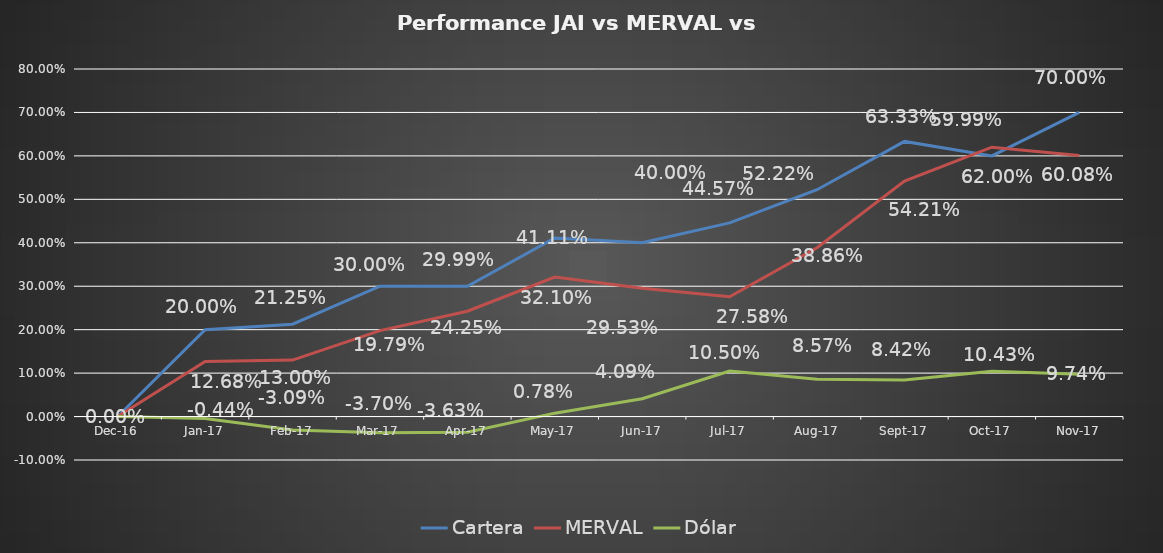
| Category | Cartera | MERVAL | Dólar |
|---|---|---|---|
| 2016-12-01 | 0 | 0 | 0 |
| 2017-01-01 | 0.2 | 0.127 | -0.004 |
| 2017-02-01 | 0.212 | 0.13 | -0.031 |
| 2017-03-01 | 0.3 | 0.198 | -0.037 |
| 2017-04-01 | 0.3 | 0.242 | -0.036 |
| 2017-05-01 | 0.411 | 0.321 | 0.008 |
| 2017-06-01 | 0.4 | 0.295 | 0.041 |
| 2017-07-01 | 0.446 | 0.276 | 0.105 |
| 2017-08-01 | 0.522 | 0.389 | 0.086 |
| 2017-09-01 | 0.633 | 0.542 | 0.084 |
| 2017-10-01 | 0.6 | 0.62 | 0.104 |
| 2017-11-01 | 0.7 | 0.601 | 0.097 |